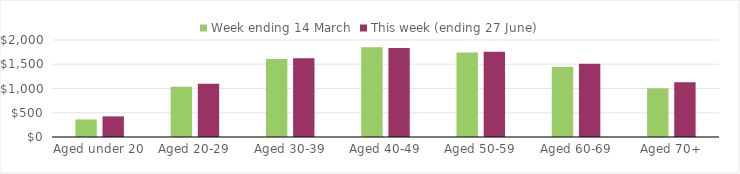
| Category | Week ending 14 March | This week (ending 27 June) |
|---|---|---|
| Aged under 20 | 361.71 | 424.91 |
| Aged 20-29 | 1036.72 | 1096.69 |
| Aged 30-39 | 1606.37 | 1623.64 |
| Aged 40-49 | 1850.88 | 1836.7 |
| Aged 50-59 | 1742.24 | 1756.04 |
| Aged 60-69 | 1444.59 | 1508.58 |
| Aged 70+ | 1004.61 | 1130.77 |